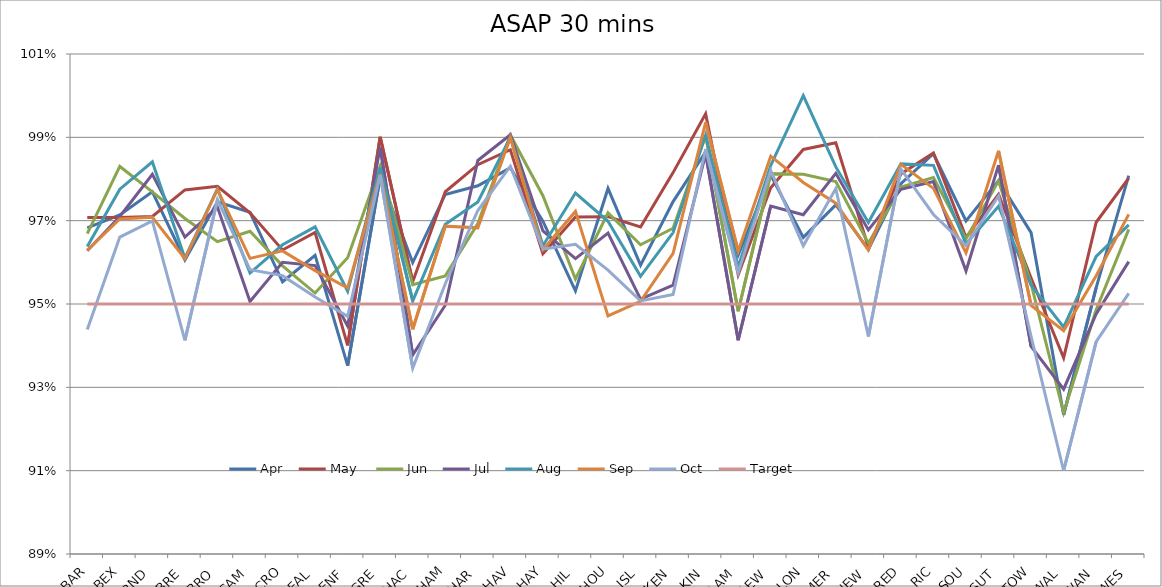
| Category | Apr | May  | Jun | Jul | Aug | Sep | Oct | Target |
|---|---|---|---|---|---|---|---|---|
| BAR | 0.968 | 0.971 | 0.967 | 0.963 | 0.964 | 0.963 | 0.944 | 0.95 |
| BEX | 0.971 | 0.971 | 0.983 | 0.971 | 0.978 | 0.97 | 0.966 | 0.95 |
| BND | 0.977 | 0.971 | 0.977 | 0.981 | 0.984 | 0.971 | 0.97 | 0.95 |
| BRE | 0.961 | 0.977 | 0.971 | 0.966 | 0.961 | 0.961 | 0.941 | 0.95 |
| BRO | 0.975 | 0.978 | 0.965 | 0.973 | 0.978 | 0.977 | 0.975 | 0.95 |
| CAM | 0.972 | 0.972 | 0.967 | 0.951 | 0.957 | 0.961 | 0.958 | 0.95 |
| CRO | 0.955 | 0.963 | 0.959 | 0.96 | 0.964 | 0.963 | 0.957 | 0.95 |
| EAL | 0.962 | 0.967 | 0.953 | 0.959 | 0.969 | 0.958 | 0.952 | 0.95 |
| ENF | 0.935 | 0.94 | 0.961 | 0.945 | 0.953 | 0.954 | 0.947 | 0.95 |
| GRE | 0.98 | 0.99 | 0.983 | 0.988 | 0.983 | 0.981 | 0.981 | 0.95 |
| HAC | 0.96 | 0.955 | 0.955 | 0.938 | 0.951 | 0.944 | 0.935 | 0.95 |
| HAM | 0.976 | 0.977 | 0.957 | 0.95 | 0.969 | 0.969 | 0.955 | 0.95 |
| HAR | 0.978 | 0.983 | 0.969 | 0.984 | 0.974 | 0.968 | 0.972 | 0.95 |
| HAV | 0.983 | 0.987 | 0.991 | 0.991 | 0.99 | 0.99 | 0.983 | 0.95 |
| HAY | 0.97 | 0.962 | 0.976 | 0.968 | 0.964 | 0.963 | 0.963 | 0.95 |
| HIL | 0.953 | 0.971 | 0.956 | 0.961 | 0.977 | 0.972 | 0.964 | 0.95 |
| HOU | 0.978 | 0.971 | 0.972 | 0.967 | 0.97 | 0.947 | 0.958 | 0.95 |
| ISL | 0.959 | 0.968 | 0.964 | 0.951 | 0.957 | 0.951 | 0.951 | 0.95 |
| KEN | 0.975 | 0.982 | 0.968 | 0.955 | 0.967 | 0.962 | 0.952 | 0.95 |
| KIN | 0.987 | 0.996 | 0.99 | 0.986 | 0.991 | 0.994 | 0.987 | 0.95 |
| LAM | 0.962 | 0.957 | 0.948 | 0.941 | 0.959 | 0.963 | 0.958 | 0.95 |
| LEW | 0.981 | 0.978 | 0.981 | 0.974 | 0.983 | 0.985 | 0.982 | 0.95 |
| LON | 0.966 | 0.987 | 0.981 | 0.971 | 1 | 0.979 | 0.964 | 0.95 |
| MER | 0.974 | 0.989 | 0.979 | 0.981 | 0.983 | 0.974 | 0.978 | 0.95 |
| NEW | 0.963 | 0.964 | 0.965 | 0.968 | 0.97 | 0.963 | 0.942 | 0.95 |
| RED | 0.979 | 0.981 | 0.978 | 0.978 | 0.984 | 0.984 | 0.982 | 0.95 |
| RIC | 0.986 | 0.986 | 0.98 | 0.979 | 0.983 | 0.978 | 0.971 | 0.95 |
| SOU | 0.97 | 0.966 | 0.966 | 0.958 | 0.964 | 0.962 | 0.964 | 0.95 |
| SUT | 0.98 | 0.976 | 0.98 | 0.983 | 0.973 | 0.987 | 0.976 | 0.95 |
| TOW | 0.967 | 0.956 | 0.955 | 0.94 | 0.955 | 0.95 | 0.942 | 0.95 |
| WAL | 0.923 | 0.937 | 0.924 | 0.93 | 0.944 | 0.944 | 0.91 | 0.95 |
| WAN | 0.954 | 0.97 | 0.949 | 0.948 | 0.961 | 0.957 | 0.941 | 0.95 |
| WES | 0.981 | 0.98 | 0.968 | 0.96 | 0.969 | 0.972 | 0.953 | 0.95 |